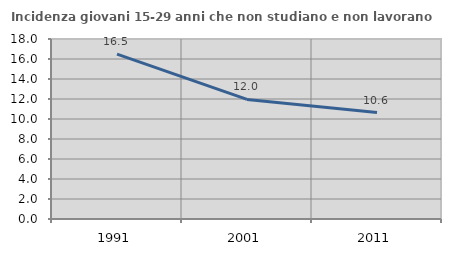
| Category | Incidenza giovani 15-29 anni che non studiano e non lavorano  |
|---|---|
| 1991.0 | 16.492 |
| 2001.0 | 11.958 |
| 2011.0 | 10.638 |